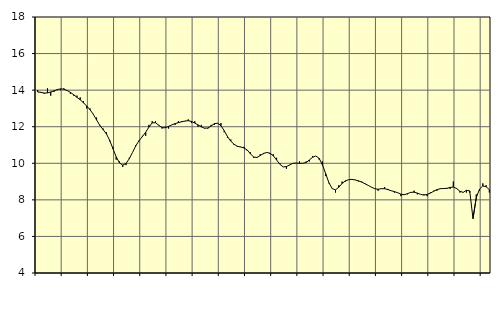
| Category | Piggar | Tillverkning av verkstadsvaror, SNI 25-30, 331 |
|---|---|---|
| nan | 14 | 13.9 |
| 87.0 | 13.9 | 13.88 |
| 87.0 | 13.8 | 13.84 |
| 87.0 | 14.1 | 13.85 |
| nan | 13.7 | 13.9 |
| 88.0 | 13.9 | 13.96 |
| 88.0 | 14 | 14.03 |
| 88.0 | 14 | 14.07 |
| nan | 14.1 | 14.05 |
| 89.0 | 14 | 13.98 |
| 89.0 | 13.8 | 13.88 |
| 89.0 | 13.7 | 13.75 |
| nan | 13.7 | 13.61 |
| 90.0 | 13.6 | 13.47 |
| 90.0 | 13.4 | 13.31 |
| 90.0 | 13 | 13.13 |
| nan | 13 | 12.93 |
| 91.0 | 12.7 | 12.68 |
| 91.0 | 12.5 | 12.37 |
| 91.0 | 12.1 | 12.07 |
| nan | 11.9 | 11.84 |
| 92.0 | 11.7 | 11.61 |
| 92.0 | 11.2 | 11.26 |
| 92.0 | 10.9 | 10.8 |
| nan | 10.2 | 10.35 |
| 93.0 | 10.1 | 10.02 |
| 93.0 | 9.8 | 9.9 |
| 93.0 | 9.9 | 9.99 |
| nan | 10.3 | 10.25 |
| 94.0 | 10.6 | 10.6 |
| 94.0 | 11 | 10.96 |
| 94.0 | 11.2 | 11.24 |
| nan | 11.5 | 11.46 |
| 95.0 | 11.5 | 11.7 |
| 95.0 | 12.1 | 11.98 |
| 95.0 | 12.3 | 12.21 |
| nan | 12.3 | 12.22 |
| 96.0 | 12.1 | 12.08 |
| 96.0 | 11.9 | 11.95 |
| 96.0 | 12 | 11.94 |
| nan | 11.9 | 12.02 |
| 97.0 | 12.1 | 12.1 |
| 97.0 | 12.1 | 12.17 |
| 97.0 | 12.3 | 12.22 |
| nan | 12.3 | 12.27 |
| 98.0 | 12.3 | 12.31 |
| 98.0 | 12.4 | 12.33 |
| 98.0 | 12.2 | 12.29 |
| nan | 12.3 | 12.2 |
| 99.0 | 12 | 12.1 |
| 99.0 | 12.1 | 11.99 |
| 99.0 | 11.9 | 11.92 |
| nan | 11.9 | 11.93 |
| 0.0 | 12.1 | 12.04 |
| 0.0 | 12.1 | 12.17 |
| 0.0 | 12.2 | 12.19 |
| nan | 12.2 | 12.06 |
| 1.0 | 11.7 | 11.78 |
| 1.0 | 11.4 | 11.46 |
| 1.0 | 11.3 | 11.21 |
| nan | 11 | 11.04 |
| 2.0 | 10.9 | 10.93 |
| 2.0 | 10.9 | 10.89 |
| 2.0 | 10.9 | 10.84 |
| nan | 10.7 | 10.73 |
| 3.0 | 10.6 | 10.52 |
| 3.0 | 10.3 | 10.34 |
| 3.0 | 10.3 | 10.32 |
| nan | 10.5 | 10.42 |
| 4.0 | 10.5 | 10.54 |
| 4.0 | 10.6 | 10.59 |
| 4.0 | 10.5 | 10.55 |
| nan | 10.5 | 10.41 |
| 5.0 | 10.3 | 10.18 |
| 5.0 | 10 | 9.95 |
| 5.0 | 9.8 | 9.8 |
| nan | 9.7 | 9.82 |
| 6.0 | 9.9 | 9.91 |
| 6.0 | 10 | 10 |
| 6.0 | 10 | 10.01 |
| nan | 10.1 | 10 |
| 7.0 | 10 | 10 |
| 7.0 | 10.1 | 10.04 |
| 7.0 | 10.1 | 10.18 |
| nan | 10.4 | 10.33 |
| 8.0 | 10.4 | 10.4 |
| 8.0 | 10.2 | 10.27 |
| 8.0 | 10.1 | 9.92 |
| nan | 9.3 | 9.43 |
| 9.0 | 8.9 | 8.93 |
| 9.0 | 8.6 | 8.61 |
| 9.0 | 8.4 | 8.55 |
| nan | 8.8 | 8.69 |
| 10.0 | 9 | 8.89 |
| 10.0 | 9 | 9.04 |
| 10.0 | 9.1 | 9.1 |
| nan | 9.1 | 9.12 |
| 11.0 | 9.1 | 9.09 |
| 11.0 | 9 | 9.04 |
| 11.0 | 9 | 8.97 |
| nan | 8.9 | 8.88 |
| 12.0 | 8.8 | 8.79 |
| 12.0 | 8.7 | 8.69 |
| 12.0 | 8.6 | 8.61 |
| nan | 8.5 | 8.58 |
| 13.0 | 8.6 | 8.61 |
| 13.0 | 8.7 | 8.61 |
| 13.0 | 8.6 | 8.56 |
| nan | 8.5 | 8.5 |
| 14.0 | 8.4 | 8.45 |
| 14.0 | 8.4 | 8.39 |
| 14.0 | 8.2 | 8.31 |
| nan | 8.3 | 8.28 |
| 15.0 | 8.3 | 8.34 |
| 15.0 | 8.4 | 8.41 |
| 15.0 | 8.5 | 8.42 |
| nan | 8.3 | 8.37 |
| 16.0 | 8.3 | 8.3 |
| 16.0 | 8.3 | 8.26 |
| 16.0 | 8.2 | 8.3 |
| nan | 8.4 | 8.37 |
| 17.0 | 8.5 | 8.47 |
| 17.0 | 8.5 | 8.56 |
| 17.0 | 8.6 | 8.61 |
| nan | 8.6 | 8.62 |
| 18.0 | 8.6 | 8.63 |
| 18.0 | 8.6 | 8.68 |
| 18.0 | 9 | 8.7 |
| nan | 8.6 | 8.62 |
| 19.0 | 8.4 | 8.47 |
| 19.0 | 8.4 | 8.41 |
| 19.0 | 8.4 | 8.52 |
| nan | 8.4 | 8.49 |
| 20.0 | 7 | 6.98 |
| 20.0 | 8.3 | 8.12 |
| 20.0 | 8.5 | 8.59 |
| nan | 8.9 | 8.76 |
| 21.0 | 8.8 | 8.72 |
| 21.0 | 8.4 | 8.56 |